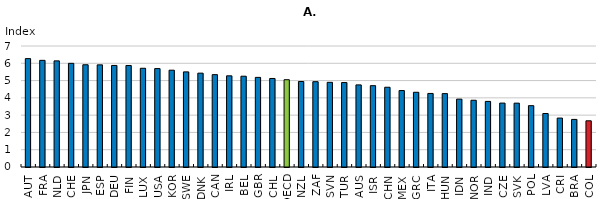
| Category | Series 0 |
|---|---|
| AUT | 6.27 |
| FRA | 6.17 |
| NLD | 6.139 |
| CHE | 5.997 |
| JPN | 5.915 |
| ESP | 5.91 |
| DEU | 5.875 |
| FIN | 5.873 |
| LUX | 5.711 |
| USA | 5.694 |
| KOR | 5.6 |
| SWE | 5.502 |
| DNK | 5.429 |
| CAN | 5.343 |
| IRL | 5.275 |
| BEL | 5.252 |
| GBR | 5.184 |
| CHL | 5.121 |
| OECD | 5.05 |
| NZL | 4.947 |
| ZAF | 4.935 |
| SVN | 4.898 |
| TUR | 4.885 |
| AUS | 4.75 |
| ISR | 4.705 |
| CHN | 4.614 |
| MEX | 4.423 |
| GRC | 4.323 |
| ITA | 4.255 |
| HUN | 4.245 |
| IDN | 3.926 |
| NOR | 3.861 |
| IND | 3.795 |
| CZE | 3.698 |
| SVK | 3.694 |
| POL | 3.548 |
| LVA | 3.095 |
| CRI | 2.831 |
| BRA | 2.753 |
| COL | 2.673 |